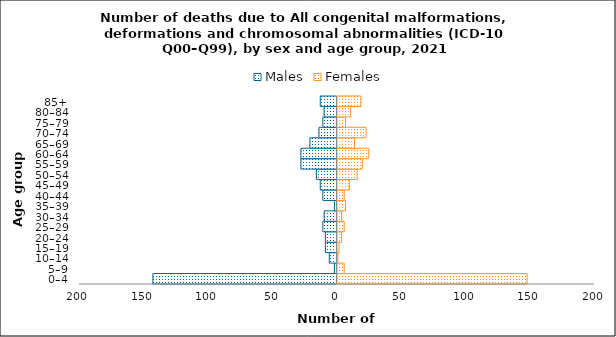
| Category | Males | Females |
|---|---|---|
| 0–4 | -143 | 148 |
| 5–9 | -2 | 6 |
| 10–14 | -6 | 1 |
| 15–19 | -9 | 2 |
| 20–24 | -9 | 4 |
| 25–29 | -11 | 6 |
| 30–34 | -10 | 4 |
| 35–39 | -2 | 7 |
| 40–44 | -11 | 6 |
| 45–49 | -13 | 10 |
| 50–54 | -16 | 16 |
| 55–59 | -28 | 20 |
| 60–64 | -28 | 25 |
| 65–69 | -21 | 14 |
| 70–74 | -14 | 23 |
| 75–79 | -11 | 7 |
| 80–84 | -10 | 11 |
| 85+ | -13 | 19 |